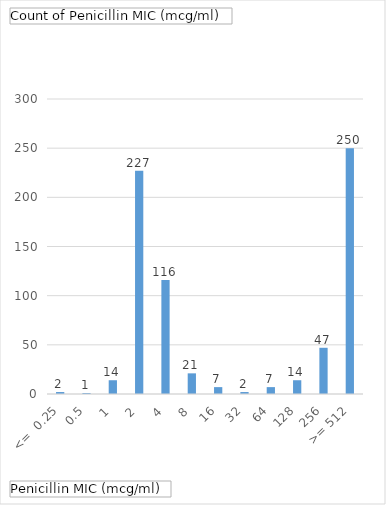
| Category | Total |
|---|---|
| <=  0.25 | 2 |
| 0.5 | 1 |
| 1 | 14 |
| 2 | 227 |
| 4 | 116 |
| 8 | 21 |
| 16 | 7 |
| 32 | 2 |
| 64 | 7 |
| 128 | 14 |
| 256 | 47 |
| >= 512 | 250 |